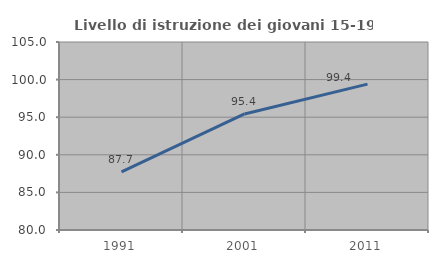
| Category | Livello di istruzione dei giovani 15-19 anni |
|---|---|
| 1991.0 | 87.716 |
| 2001.0 | 95.429 |
| 2011.0 | 99.401 |